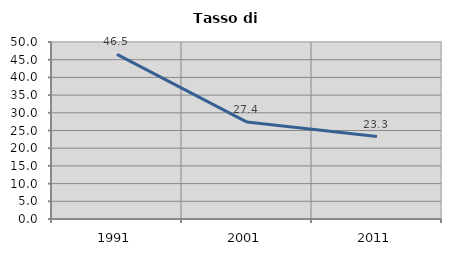
| Category | Tasso di disoccupazione   |
|---|---|
| 1991.0 | 46.508 |
| 2001.0 | 27.37 |
| 2011.0 | 23.288 |